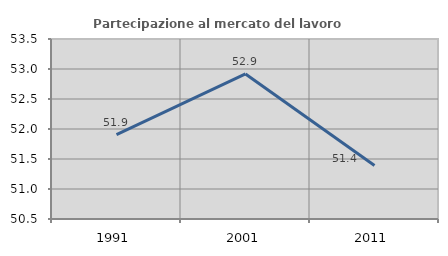
| Category | Partecipazione al mercato del lavoro  femminile |
|---|---|
| 1991.0 | 51.908 |
| 2001.0 | 52.918 |
| 2011.0 | 51.391 |